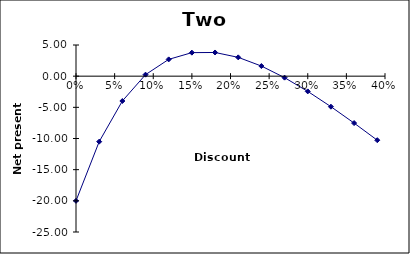
| Category | Series 0 |
|---|---|
| 0.0 | -20 |
| 0.03 | -10.508 |
| 0.06 | -3.985 |
| 0.09 | 0.241 |
| 0.12 | 2.693 |
| 0.15 | 3.774 |
| 0.18 | 3.801 |
| 0.21 | 3.02 |
| 0.24 | 1.623 |
| 0.27 | -0.237 |
| 0.3 | -2.441 |
| 0.33 | -4.896 |
| 0.36 | -7.526 |
| 0.39 | -10.275 |